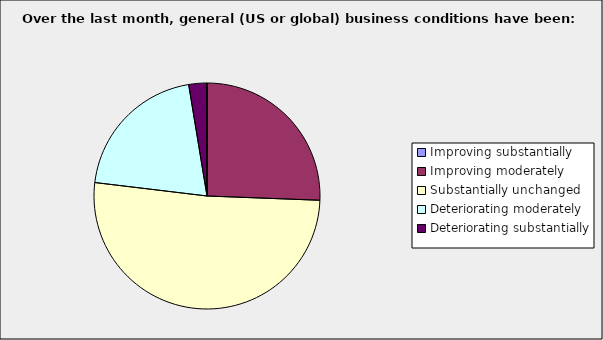
| Category | Series 0 |
|---|---|
| Improving substantially | 0 |
| Improving moderately | 0.256 |
| Substantially unchanged | 0.513 |
| Deteriorating moderately | 0.205 |
| Deteriorating substantially | 0.026 |